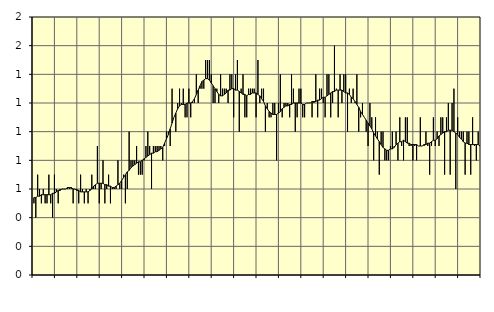
| Category | Fast anställda utomlands | Series 1 |
|---|---|---|
| nan | 0.5 | 0.54 |
| 1.0 | 0.4 | 0.54 |
| 1.0 | 0.7 | 0.55 |
| 1.0 | 0.6 | 0.55 |
| 1.0 | 0.5 | 0.56 |
| 1.0 | 0.6 | 0.56 |
| 1.0 | 0.5 | 0.56 |
| 1.0 | 0.5 | 0.56 |
| 1.0 | 0.7 | 0.56 |
| 1.0 | 0.5 | 0.56 |
| 1.0 | 0.4 | 0.57 |
| 1.0 | 0.7 | 0.57 |
| nan | 0.6 | 0.58 |
| 2.0 | 0.5 | 0.59 |
| 2.0 | 0.6 | 0.59 |
| 2.0 | 0.6 | 0.6 |
| 2.0 | 0.6 | 0.6 |
| 2.0 | 0.6 | 0.6 |
| 2.0 | 0.6 | 0.61 |
| 2.0 | 0.6 | 0.61 |
| 2.0 | 0.6 | 0.61 |
| 2.0 | 0.5 | 0.6 |
| 2.0 | 0.6 | 0.6 |
| 2.0 | 0.6 | 0.59 |
| nan | 0.5 | 0.59 |
| 3.0 | 0.7 | 0.58 |
| 3.0 | 0.6 | 0.58 |
| 3.0 | 0.5 | 0.58 |
| 3.0 | 0.6 | 0.58 |
| 3.0 | 0.5 | 0.58 |
| 3.0 | 0.6 | 0.59 |
| 3.0 | 0.7 | 0.6 |
| 3.0 | 0.6 | 0.62 |
| 3.0 | 0.6 | 0.63 |
| 3.0 | 0.9 | 0.64 |
| 3.0 | 0.5 | 0.64 |
| nan | 0.6 | 0.64 |
| 4.0 | 0.8 | 0.64 |
| 4.0 | 0.5 | 0.63 |
| 4.0 | 0.6 | 0.63 |
| 4.0 | 0.7 | 0.62 |
| 4.0 | 0.5 | 0.62 |
| 4.0 | 0.6 | 0.61 |
| 4.0 | 0.6 | 0.61 |
| 4.0 | 0.6 | 0.62 |
| 4.0 | 0.8 | 0.63 |
| 4.0 | 0.6 | 0.64 |
| 4.0 | 0.6 | 0.66 |
| nan | 0.7 | 0.68 |
| 5.0 | 0.5 | 0.7 |
| 5.0 | 0.6 | 0.72 |
| 5.0 | 1 | 0.73 |
| 5.0 | 0.8 | 0.75 |
| 5.0 | 0.8 | 0.76 |
| 5.0 | 0.8 | 0.77 |
| 5.0 | 0.9 | 0.78 |
| 5.0 | 0.7 | 0.79 |
| 5.0 | 0.7 | 0.79 |
| 5.0 | 0.7 | 0.8 |
| 5.0 | 0.8 | 0.81 |
| nan | 0.9 | 0.82 |
| 6.0 | 1 | 0.83 |
| 6.0 | 0.9 | 0.84 |
| 6.0 | 0.6 | 0.85 |
| 6.0 | 0.9 | 0.85 |
| 6.0 | 0.9 | 0.86 |
| 6.0 | 0.9 | 0.86 |
| 6.0 | 0.9 | 0.87 |
| 6.0 | 0.9 | 0.88 |
| 6.0 | 0.8 | 0.89 |
| 6.0 | 0.9 | 0.92 |
| 6.0 | 1 | 0.95 |
| nan | 1 | 0.98 |
| 7.0 | 0.9 | 1.02 |
| 7.0 | 1.3 | 1.06 |
| 7.0 | 1.1 | 1.1 |
| 7.0 | 1 | 1.13 |
| 7.0 | 1.2 | 1.16 |
| 7.0 | 1.3 | 1.18 |
| 7.0 | 1.2 | 1.19 |
| 7.0 | 1.3 | 1.19 |
| 7.0 | 1.1 | 1.19 |
| 7.0 | 1.1 | 1.2 |
| 7.0 | 1.3 | 1.2 |
| nan | 1.1 | 1.2 |
| 8.0 | 1.2 | 1.21 |
| 8.0 | 1.2 | 1.23 |
| 8.0 | 1.4 | 1.26 |
| 8.0 | 1.2 | 1.29 |
| 8.0 | 1.3 | 1.32 |
| 8.0 | 1.3 | 1.35 |
| 8.0 | 1.3 | 1.36 |
| 8.0 | 1.5 | 1.37 |
| 8.0 | 1.5 | 1.37 |
| 8.0 | 1.5 | 1.36 |
| 8.0 | 1.4 | 1.34 |
| nan | 1.2 | 1.32 |
| 9.0 | 1.2 | 1.3 |
| 9.0 | 1.3 | 1.28 |
| 9.0 | 1.2 | 1.26 |
| 9.0 | 1.4 | 1.25 |
| 9.0 | 1.3 | 1.25 |
| 9.0 | 1.3 | 1.26 |
| 9.0 | 1.3 | 1.27 |
| 9.0 | 1.2 | 1.29 |
| 9.0 | 1.4 | 1.29 |
| 9.0 | 1.4 | 1.3 |
| 9.0 | 1.1 | 1.3 |
| nan | 1.4 | 1.29 |
| 10.0 | 1.5 | 1.29 |
| 10.0 | 1 | 1.28 |
| 10.0 | 1.3 | 1.27 |
| 10.0 | 1.4 | 1.26 |
| 10.0 | 1.1 | 1.26 |
| 10.0 | 1.1 | 1.25 |
| 10.0 | 1.3 | 1.26 |
| 10.0 | 1.3 | 1.26 |
| 10.0 | 1.3 | 1.27 |
| 10.0 | 1.3 | 1.27 |
| 10.0 | 1.1 | 1.27 |
| nan | 1.5 | 1.26 |
| 11.0 | 1.2 | 1.25 |
| 11.0 | 1.3 | 1.23 |
| 11.0 | 1.3 | 1.21 |
| 11.0 | 1 | 1.18 |
| 11.0 | 1.2 | 1.16 |
| 11.0 | 1.1 | 1.14 |
| 11.0 | 1.1 | 1.13 |
| 11.0 | 1.2 | 1.12 |
| 11.0 | 1.2 | 1.12 |
| 11.0 | 0.8 | 1.12 |
| 11.0 | 1.2 | 1.13 |
| nan | 1.4 | 1.14 |
| 12.0 | 1.1 | 1.16 |
| 12.0 | 1.2 | 1.17 |
| 12.0 | 1.2 | 1.18 |
| 12.0 | 1.2 | 1.18 |
| 12.0 | 1.1 | 1.19 |
| 12.0 | 1.4 | 1.19 |
| 12.0 | 1.3 | 1.2 |
| 12.0 | 1 | 1.2 |
| 12.0 | 1.1 | 1.2 |
| 12.0 | 1.3 | 1.2 |
| 12.0 | 1.3 | 1.2 |
| nan | 1.1 | 1.19 |
| 13.0 | 1.1 | 1.19 |
| 13.0 | 1.2 | 1.2 |
| 13.0 | 1.2 | 1.2 |
| 13.0 | 1.2 | 1.2 |
| 13.0 | 1.1 | 1.21 |
| 13.0 | 1.2 | 1.21 |
| 13.0 | 1.4 | 1.21 |
| 13.0 | 1.1 | 1.22 |
| 13.0 | 1.3 | 1.22 |
| 13.0 | 1.3 | 1.23 |
| 13.0 | 1.2 | 1.24 |
| nan | 1.1 | 1.24 |
| 14.0 | 1.4 | 1.25 |
| 14.0 | 1.4 | 1.26 |
| 14.0 | 1.1 | 1.27 |
| 14.0 | 1.2 | 1.28 |
| 14.0 | 1.6 | 1.28 |
| 14.0 | 1.3 | 1.29 |
| 14.0 | 1.1 | 1.29 |
| 14.0 | 1.4 | 1.29 |
| 14.0 | 1.2 | 1.29 |
| 14.0 | 1.4 | 1.28 |
| 14.0 | 1.4 | 1.27 |
| nan | 1 | 1.27 |
| 15.0 | 1.3 | 1.26 |
| 15.0 | 1.2 | 1.24 |
| 15.0 | 1.3 | 1.23 |
| 15.0 | 1.2 | 1.21 |
| 15.0 | 1.4 | 1.19 |
| 15.0 | 1 | 1.17 |
| 15.0 | 1.1 | 1.14 |
| 15.0 | 1.2 | 1.12 |
| 15.0 | 1.1 | 1.1 |
| 15.0 | 1 | 1.08 |
| 15.0 | 0.9 | 1.06 |
| nan | 1.2 | 1.04 |
| 16.0 | 1.1 | 1.02 |
| 16.0 | 0.8 | 0.99 |
| 16.0 | 1.1 | 0.97 |
| 16.0 | 1 | 0.95 |
| 16.0 | 0.7 | 0.93 |
| 16.0 | 1 | 0.91 |
| 16.0 | 1 | 0.89 |
| 16.0 | 0.8 | 0.88 |
| 16.0 | 0.8 | 0.87 |
| 16.0 | 0.8 | 0.87 |
| 16.0 | 0.9 | 0.88 |
| nan | 1 | 0.88 |
| 17.0 | 0.9 | 0.89 |
| 17.0 | 1 | 0.91 |
| 17.0 | 0.8 | 0.92 |
| 17.0 | 1.1 | 0.93 |
| 17.0 | 0.9 | 0.93 |
| 17.0 | 0.8 | 0.94 |
| 17.0 | 1.1 | 0.93 |
| 17.0 | 1.1 | 0.92 |
| 17.0 | 0.9 | 0.92 |
| 17.0 | 0.9 | 0.91 |
| 17.0 | 0.8 | 0.91 |
| nan | 0.9 | 0.91 |
| 18.0 | 0.8 | 0.91 |
| 18.0 | 0.9 | 0.9 |
| 18.0 | 1.1 | 0.9 |
| 18.0 | 0.9 | 0.9 |
| 18.0 | 0.9 | 0.91 |
| 18.0 | 1 | 0.91 |
| 18.0 | 0.9 | 0.92 |
| 18.0 | 0.7 | 0.92 |
| 18.0 | 0.9 | 0.93 |
| 18.0 | 1.1 | 0.94 |
| 18.0 | 0.9 | 0.94 |
| nan | 1 | 0.95 |
| 19.0 | 0.9 | 0.97 |
| 19.0 | 1.1 | 0.98 |
| 19.0 | 1.1 | 0.99 |
| 19.0 | 0.7 | 1 |
| 19.0 | 1.1 | 1 |
| 19.0 | 1.2 | 1.01 |
| 19.0 | 0.7 | 1.01 |
| 19.0 | 1.2 | 1.01 |
| 19.0 | 1.3 | 1 |
| 19.0 | 0.6 | 0.99 |
| 19.0 | 1.1 | 0.98 |
| nan | 1 | 0.96 |
| 20.0 | 1 | 0.95 |
| 20.0 | 1 | 0.93 |
| 20.0 | 0.7 | 0.92 |
| 20.0 | 1 | 0.92 |
| 20.0 | 1 | 0.91 |
| 20.0 | 0.7 | 0.91 |
| 20.0 | 1.1 | 0.91 |
| 20.0 | 0.9 | 0.91 |
| 20.0 | 0.8 | 0.91 |
| 20.0 | 1 | 0.91 |
| 20.0 | 0.9 | 0.9 |